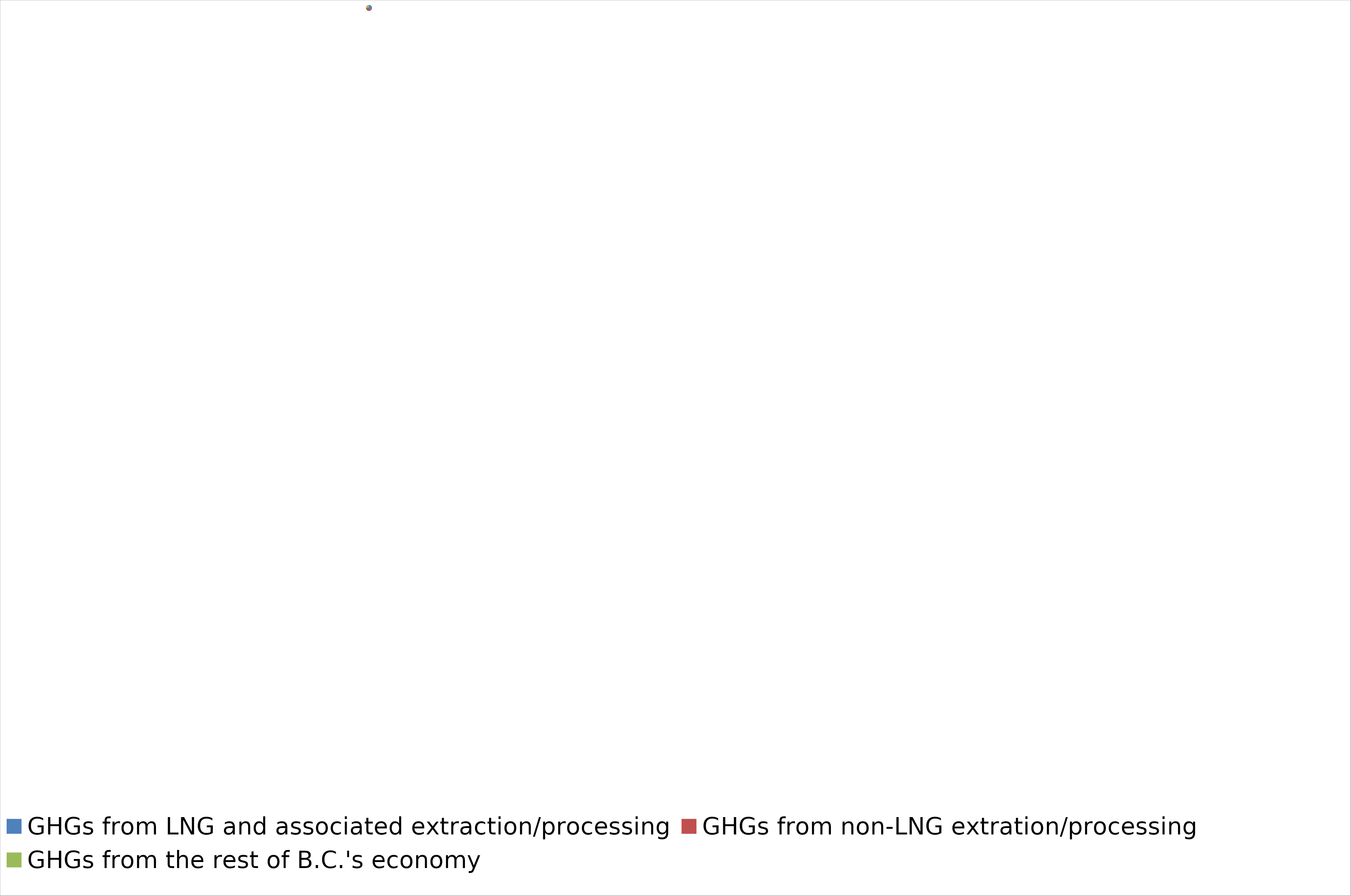
| Category | Series 0 |
|---|---|
| GHGs from LNG and associated extraction/processing | 17.418 |
| GHGs from non-LNG extration/processing | 15.264 |
| GHGs from the rest of B.C.'s economy | 10.982 |